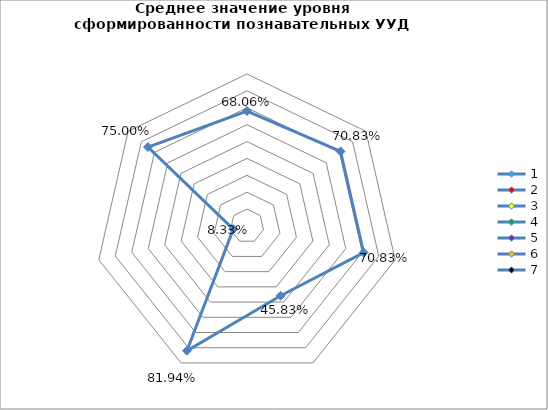
| Category | Series 0 |
|---|---|
| 0 | 0.681 |
| 1 | 0.708 |
| 2 | 0.708 |
| 3 | 0.458 |
| 4 | 0.819 |
| 5 | 0.083 |
| 6 | 0.75 |